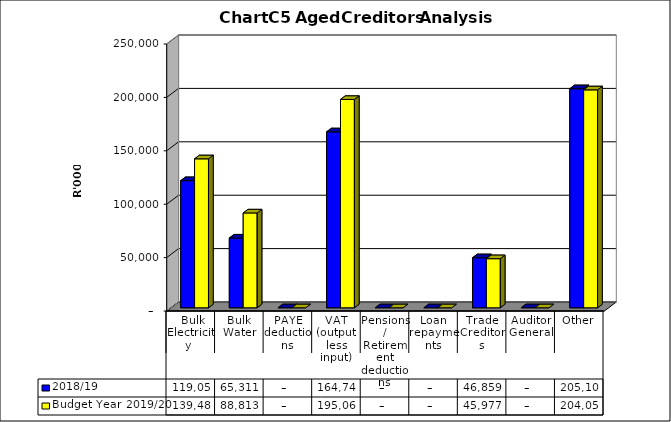
| Category | 2018/19 | Budget Year 2019/20 |
|---|---|---|
|  Bulk Electricity  | 119049668 | 139486629.58 |
| Bulk Water | 65311147 | 88812802.6 |
| PAYE deductions | 0 | 0 |
| VAT (output less input) | 164743486 | 195068066.08 |
| Pensions / Retirement deductions | 0 | 0 |
| Loan repayments | 0 | 0 |
| Trade Creditors | 46858592 | 45976996.17 |
| Auditor General | 0 | 0 |
| Other | 205107527 | 204059176.5 |